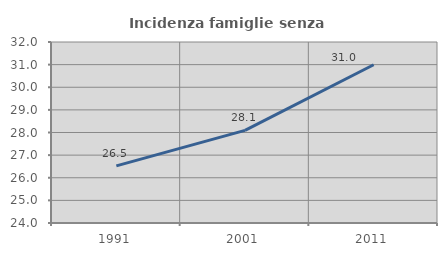
| Category | Incidenza famiglie senza nuclei |
|---|---|
| 1991.0 | 26.526 |
| 2001.0 | 28.093 |
| 2011.0 | 30.995 |